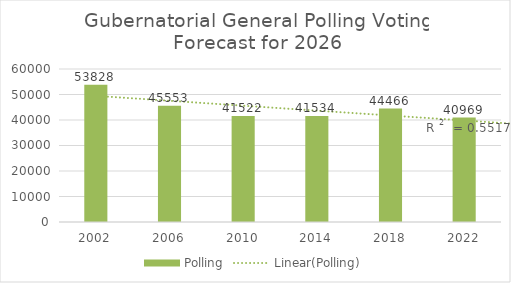
| Category | Polling |
|---|---|
| 2002.0 | 53828 |
| 2006.0 | 45553 |
| 2010.0 | 41522 |
| 2014.0 | 41534 |
| 2018.0 | 44466 |
| 2022.0 | 40969 |